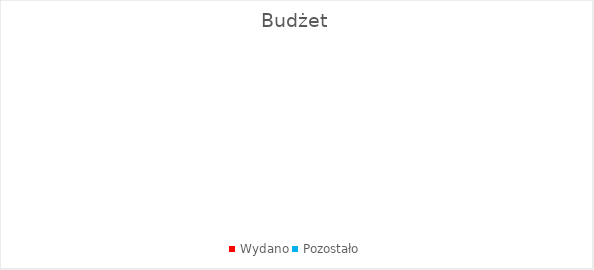
| Category | Series 0 |
|---|---|
| Wydano | 0 |
| Pozostało | 0 |